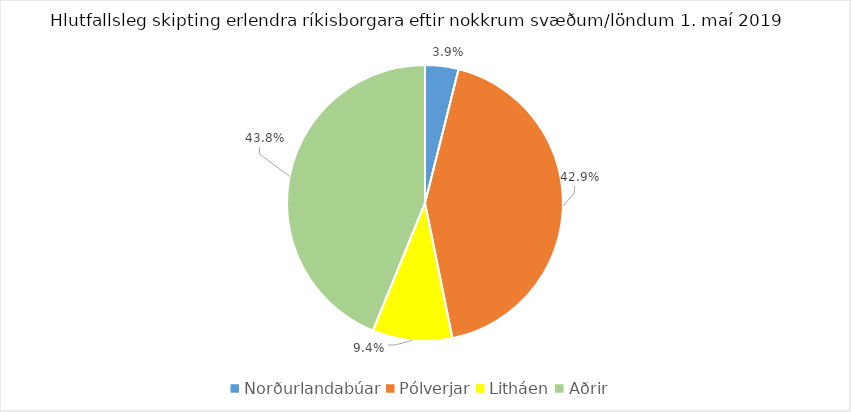
| Category | Series 0 |
|---|---|
| Norðurlandabúar | 0.039 |
| Pólverjar | 0.429 |
| Litháen | 0.094 |
| Aðrir | 0.438 |